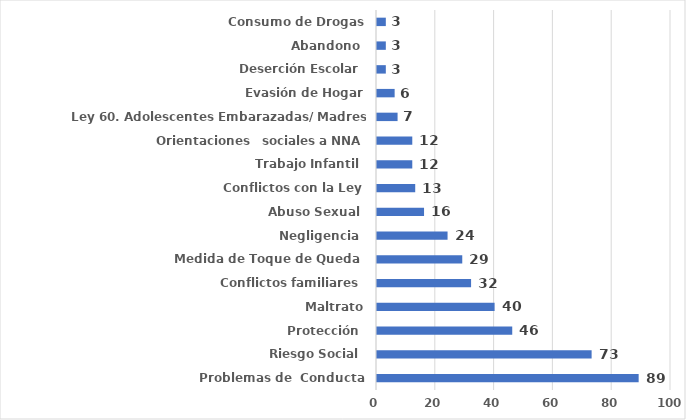
| Category | Series 0 |
|---|---|
| Problemas de  Conducta | 89 |
| Riesgo Social  | 73 |
| Protección  | 46 |
| Maltrato | 40 |
| Conflictos familiares  | 32 |
| Medida de Toque de Queda  | 29 |
| Negligencia  | 24 |
| Abuso Sexual  | 16 |
| Conflictos con la Ley | 13 |
| Trabajo Infantil  | 12 |
| Orientaciones   sociales a NNA | 12 |
| Ley 60. Adolescentes Embarazadas/ Madres Adolescentes. | 7 |
| Evasión de Hogar | 6 |
| Deserción Escolar  | 3 |
| Abandono  | 3 |
| Consumo de Drogas | 3 |